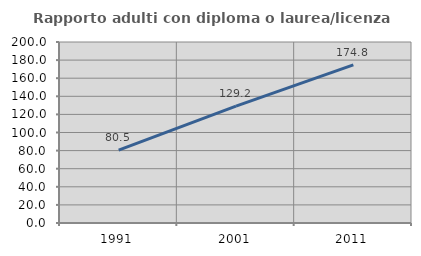
| Category | Rapporto adulti con diploma o laurea/licenza media  |
|---|---|
| 1991.0 | 80.519 |
| 2001.0 | 129.204 |
| 2011.0 | 174.783 |